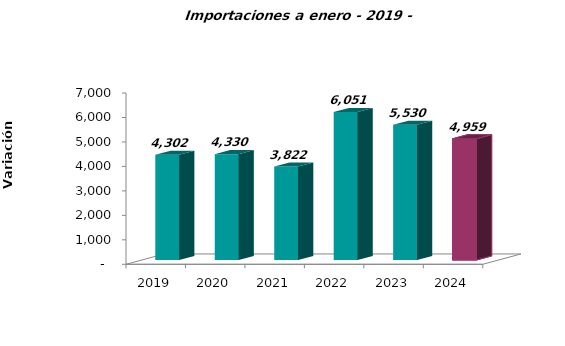
| Category | Series 0 |
|---|---|
| 2019-01-01 | 4302.195 |
| 2020-01-01 | 4329.618 |
| 2021-01-01 | 3822.025 |
| 2022-01-01 | 6050.578 |
| 2023-01-01 | 5529.665 |
| 2024-01-01 | 4958.983 |